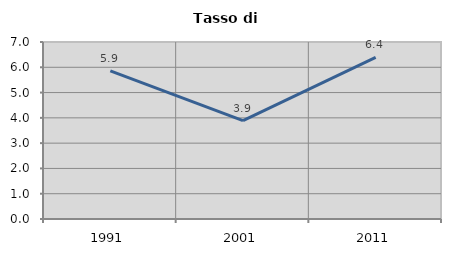
| Category | Tasso di disoccupazione   |
|---|---|
| 1991.0 | 5.857 |
| 2001.0 | 3.893 |
| 2011.0 | 6.394 |